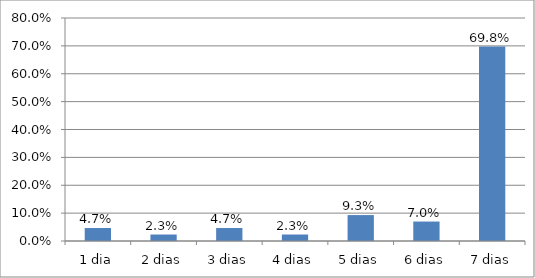
| Category | Series 0 |
|---|---|
| 1 dia | 0.047 |
| 2 dias | 0.023 |
| 3 dias | 0.047 |
| 4 dias | 0.023 |
| 5 dias | 0.093 |
| 6 dias | 0.07 |
| 7 dias | 0.698 |